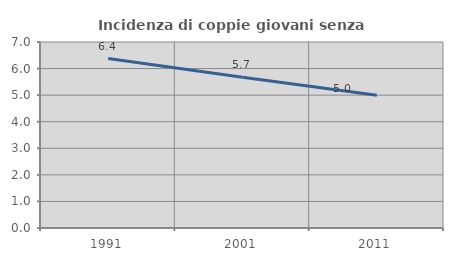
| Category | Incidenza di coppie giovani senza figli |
|---|---|
| 1991.0 | 6.378 |
| 2001.0 | 5.677 |
| 2011.0 | 5 |